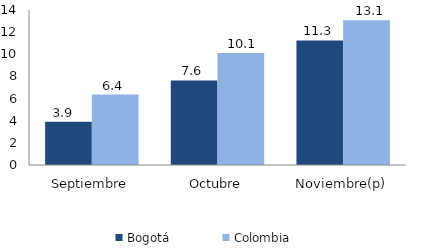
| Category | Bogotá | Colombia |
|---|---|---|
| Septiembre | 3.908 | 6.363 |
| Octubre | 7.639 | 10.107 |
| Noviembre(p) | 11.256 | 13.082 |